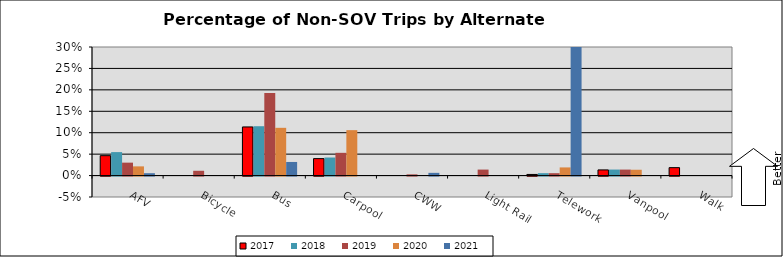
| Category | 2017 | 2018 | 2019 | 2020 | 2021 |
|---|---|---|---|---|---|
| AFV | 0.046 | 0.055 | 0.03 | 0.021 | 0.006 |
| Bicycle | 0 | 0 | 0.011 | 0 | 0 |
| Bus | 0.113 | 0.115 | 0.193 | 0.111 | 0.032 |
| Carpool | 0.04 | 0.042 | 0.053 | 0.106 | 0 |
| CWW | 0 | 0 | 0.003 | 0 | 0.006 |
| Light Rail | 0 | 0 | 0.014 | 0 | 0 |
| Telework | 0.003 | 0.006 | 0.006 | 0.019 | 0.387 |
| Vanpool | 0.013 | 0.014 | 0.014 | 0.014 | 0 |
| Walk | 0.018 | 0 | 0 | 0 | 0 |